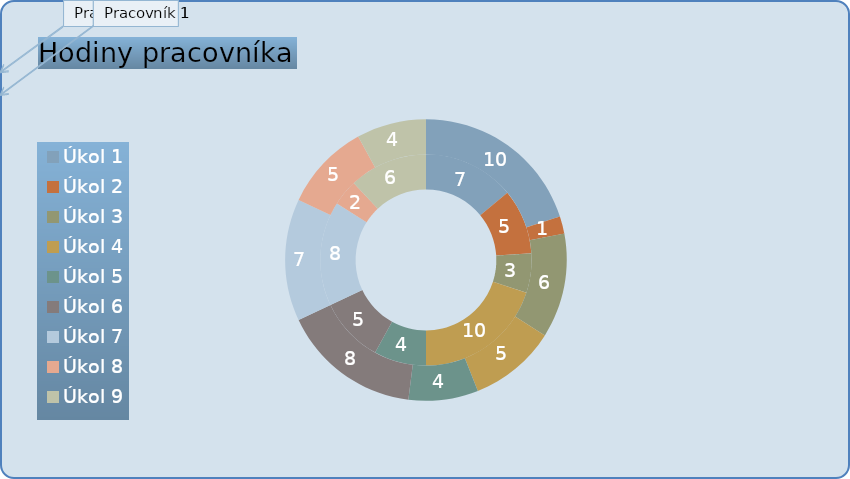
| Category | Pracovník 1 (hod.) | Pracovník 2 (hod.) |
|---|---|---|
| Úkol 1 | 7 | 10 |
| Úkol 2 | 5 | 1 |
| Úkol 3 | 3 | 6 |
| Úkol 4 | 10 | 5 |
| Úkol 5 | 4 | 4 |
| Úkol 6 | 5 | 8 |
| Úkol 7 | 8 | 7 |
| Úkol 8 | 2 | 5 |
| Úkol 9 | 6 | 4 |